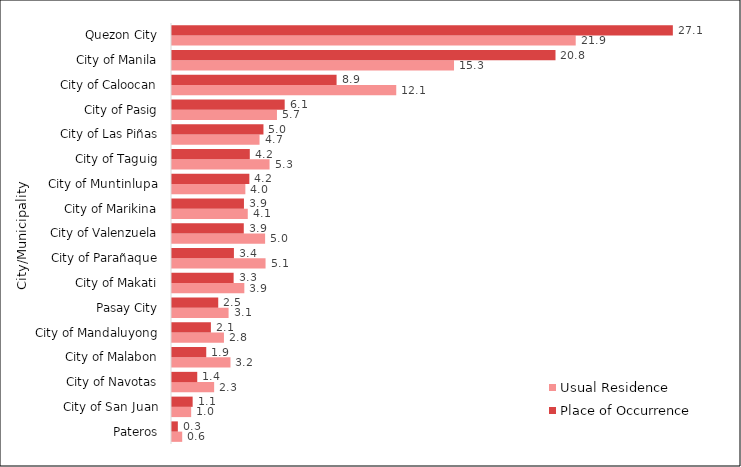
| Category | Usual Residence | Place of Occurrence |
|---|---|---|
|  Pateros | 0.552 | 0.317 |
|  City of San Juan | 1.038 | 1.118 |
|  City of Navotas | 2.282 | 1.367 |
|  City of Malabon | 3.167 | 1.855 |
|  City of Mandaluyong | 2.813 | 2.106 |
|  Pasay City | 3.064 | 2.504 |
|  City of Makati | 3.917 | 3.337 |
|  City of Parañaque | 5.066 | 3.353 |
|  City of Valenzuela | 5.042 | 3.888 |
|  City of Marikina | 4.103 | 3.897 |
|  City of Muntinlupa | 3.973 | 4.189 |
|  City of Taguig | 5.283 | 4.213 |
|  City of Las Piñas | 4.74 | 4.953 |
|  City of Pasig | 5.683 | 6.102 |
|  City of Caloocan | 12.143 | 8.913 |
|  City of Manila | 15.272 | 20.767 |
|  Quezon City | 21.862 | 27.122 |